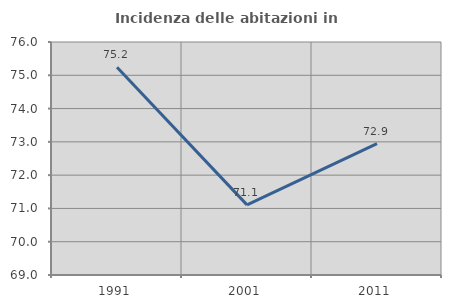
| Category | Incidenza delle abitazioni in proprietà  |
|---|---|
| 1991.0 | 75.24 |
| 2001.0 | 71.106 |
| 2011.0 | 72.944 |